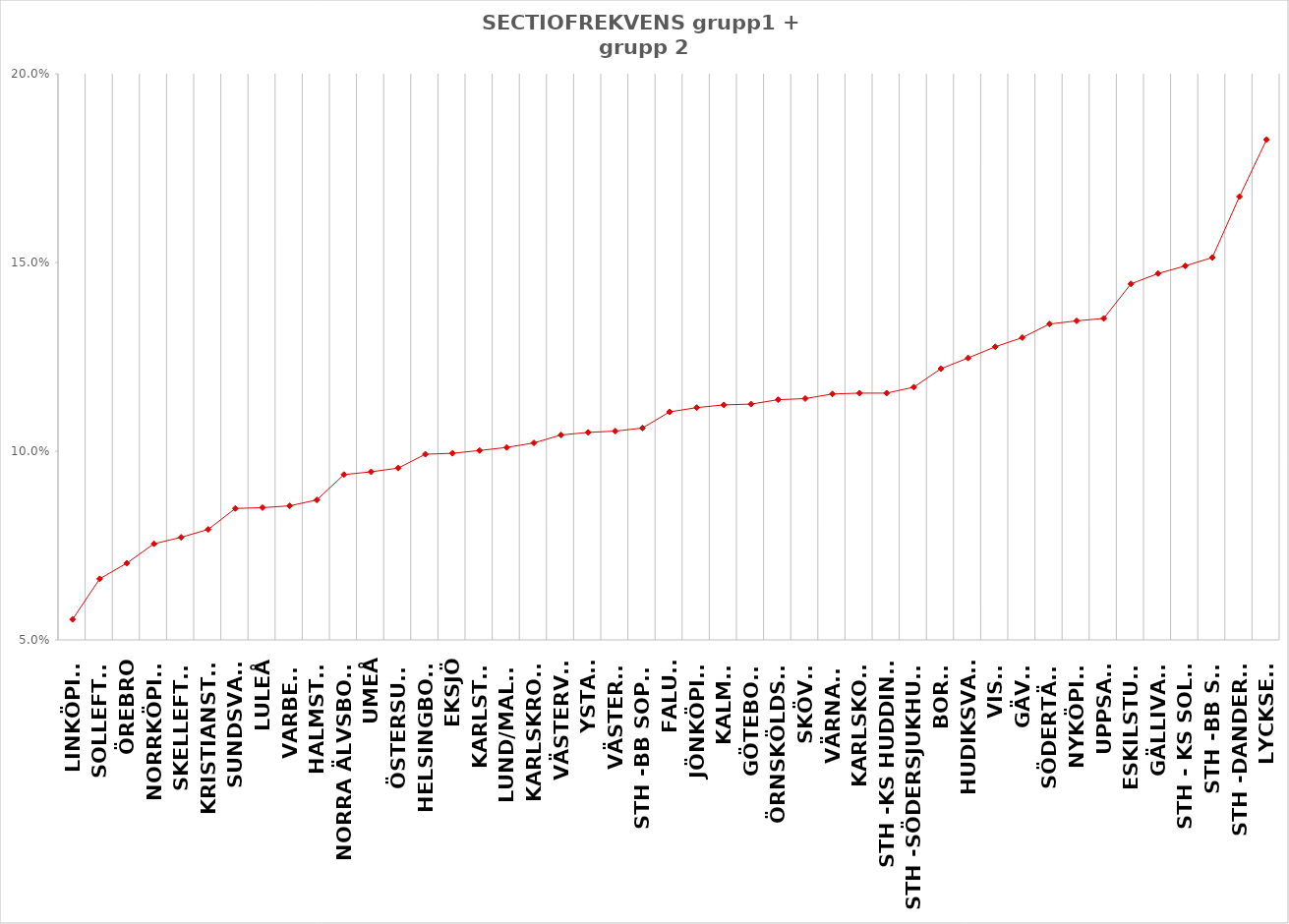
| Category | Series 0 |
|---|---|
| Linköping | 0.055 |
| Sollefteå | 0.066 |
| Örebro | 0.07 |
| Norrköping | 0.075 |
| Skellefteå | 0.077 |
| Kristianstad | 0.079 |
| Sundsvall | 0.085 |
| Luleå | 0.085 |
| Varberg | 0.086 |
| Halmstad | 0.087 |
| Norra Älvsborg | 0.094 |
| Umeå | 0.095 |
| Östersund | 0.096 |
| Helsingborg | 0.099 |
| Eksjö | 0.099 |
| Karlstad | 0.1 |
| Lund/Malmö | 0.101 |
| Karlskrona | 0.102 |
| Västervik | 0.104 |
| Ystad | 0.105 |
| Västerås | 0.105 |
| Sth -BB Sophia | 0.106 |
| Falun | 0.11 |
| Jönköping | 0.112 |
| Kalmar | 0.112 |
| Göteborg | 0.112 |
| Örnsköldsvik | 0.114 |
| Skövde | 0.114 |
| Värnamo | 0.115 |
| Karlskoga | 0.115 |
| Sth -KS Huddinge | 0.115 |
| Sth -Södersjukhuset | 0.117 |
| Borås | 0.122 |
| Hudiksvall | 0.125 |
| Visby | 0.128 |
| Gävle | 0.13 |
| Södertälje | 0.134 |
| Nyköping | 0.135 |
| Uppsala | 0.135 |
| Eskilstuna | 0.144 |
| Gällivare | 0.147 |
| Sth - KS Solna | 0.149 |
| Sth -BB Sth | 0.151 |
| Sth -Danderyd | 0.167 |
| Lycksele | 0.183 |